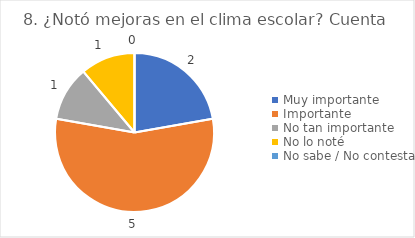
| Category | 8. ¿Notó mejoras en el clima escolar? |
|---|---|
| Muy importante  | 0.222 |
| Importante  | 0.556 |
| No tan importante  | 0.111 |
| No lo noté  | 0.111 |
| No sabe / No contesta | 0 |